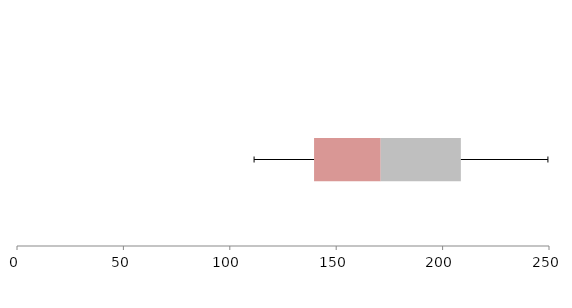
| Category | Series 1 | Series 2 | Series 3 |
|---|---|---|---|
| 0 | 139.595 | 31.315 | 37.674 |